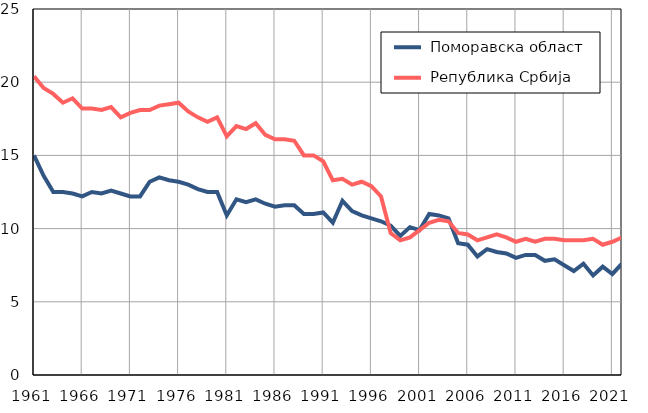
| Category |  Поморавска област |  Република Србија |
|---|---|---|
| 1961.0 | 15 | 20.4 |
| 1962.0 | 13.6 | 19.6 |
| 1963.0 | 12.5 | 19.2 |
| 1964.0 | 12.5 | 18.6 |
| 1965.0 | 12.4 | 18.9 |
| 1966.0 | 12.2 | 18.2 |
| 1967.0 | 12.5 | 18.2 |
| 1968.0 | 12.4 | 18.1 |
| 1969.0 | 12.6 | 18.3 |
| 1970.0 | 12.4 | 17.6 |
| 1971.0 | 12.2 | 17.9 |
| 1972.0 | 12.2 | 18.1 |
| 1973.0 | 13.2 | 18.1 |
| 1974.0 | 13.5 | 18.4 |
| 1975.0 | 13.3 | 18.5 |
| 1976.0 | 13.2 | 18.6 |
| 1977.0 | 13 | 18 |
| 1978.0 | 12.7 | 17.6 |
| 1979.0 | 12.5 | 17.3 |
| 1980.0 | 12.5 | 17.6 |
| 1981.0 | 10.9 | 16.3 |
| 1982.0 | 12 | 17 |
| 1983.0 | 11.8 | 16.8 |
| 1984.0 | 12 | 17.2 |
| 1985.0 | 11.7 | 16.4 |
| 1986.0 | 11.5 | 16.1 |
| 1987.0 | 11.6 | 16.1 |
| 1988.0 | 11.6 | 16 |
| 1989.0 | 11 | 15 |
| 1990.0 | 11 | 15 |
| 1991.0 | 11.1 | 14.6 |
| 1992.0 | 10.4 | 13.3 |
| 1993.0 | 11.9 | 13.4 |
| 1994.0 | 11.2 | 13 |
| 1995.0 | 10.9 | 13.2 |
| 1996.0 | 10.7 | 12.9 |
| 1997.0 | 10.5 | 12.2 |
| 1998.0 | 10.2 | 9.7 |
| 1999.0 | 9.5 | 9.2 |
| 2000.0 | 10.1 | 9.4 |
| 2001.0 | 9.9 | 9.9 |
| 2002.0 | 11 | 10.4 |
| 2003.0 | 10.9 | 10.6 |
| 2004.0 | 10.7 | 10.5 |
| 2005.0 | 9 | 9.7 |
| 2006.0 | 8.9 | 9.6 |
| 2007.0 | 8.1 | 9.2 |
| 2008.0 | 8.6 | 9.4 |
| 2009.0 | 8.4 | 9.6 |
| 2010.0 | 8.3 | 9.4 |
| 2011.0 | 8 | 9.1 |
| 2012.0 | 8.2 | 9.3 |
| 2013.0 | 8.2 | 9.1 |
| 2014.0 | 7.8 | 9.3 |
| 2015.0 | 7.9 | 9.3 |
| 2016.0 | 7.5 | 9.2 |
| 2017.0 | 7.1 | 9.2 |
| 2018.0 | 7.6 | 9.2 |
| 2019.0 | 6.8 | 9.3 |
| 2020.0 | 7.4 | 8.9 |
| 2021.0 | 6.9 | 9.1 |
| 2022.0 | 7.6 | 9.4 |